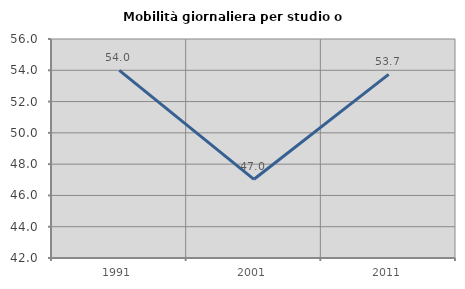
| Category | Mobilità giornaliera per studio o lavoro |
|---|---|
| 1991.0 | 53.996 |
| 2001.0 | 47.031 |
| 2011.0 | 53.737 |